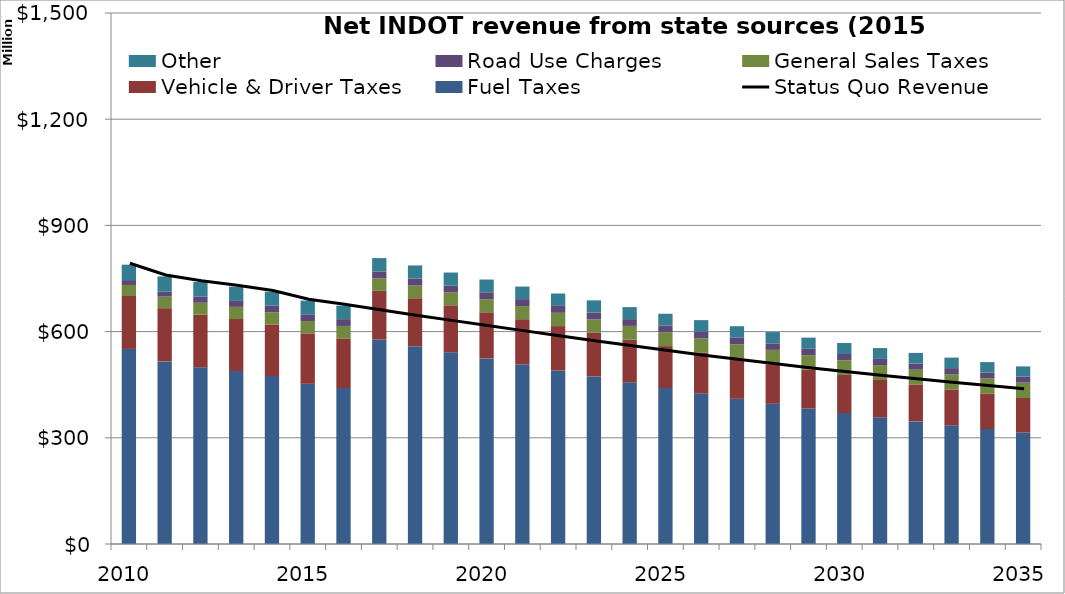
| Category | Fuel Taxes | Vehicle & Driver Taxes | General Sales Taxes | Road Use Charges | Other |
|---|---|---|---|---|---|
| 2010.0 | 551021678.822 | 149601878.461 | 31126844.809 | 13792753.804 | 43446075.375 |
| 2011.0 | 515774752.124 | 150410753.411 | 32641127.149 | 14702584.452 | 42386415 |
| 2012.0 | 498984226.286 | 148663431.89 | 33850812.65 | 17137076.564 | 41352600 |
| 2013.0 | 488463001.237 | 147076709.793 | 34365432.976 | 16756776.055 | 40344000 |
| 2014.0 | 474240087.897 | 146032010.404 | 34352434.178 | 18594417.254 | 39360000 |
| 2015.0 | 452560137.233 | 142541704.908 | 34709004.589 | 18999667.964 | 38784000 |
| 2016.0 | 440661010.657 | 140114744.75 | 35210101.19 | 19164292.938 | 38216429.268 |
| 2017.0 | 577234256.56 | 137761722.966 | 35581391.785 | 19410173.649 | 37657164.45 |
| 2018.0 | 558961859.155 | 135270654.083 | 35963581.581 | 19604103.909 | 37106083.994 |
| 2019.0 | 541401044.245 | 132799645.209 | 36419260.803 | 19657795.415 | 36563068.131 |
| 2020.0 | 524218134.156 | 130353380.32 | 36823762.69 | 19649272.163 | 36027998.841 |
| 2021.0 | 507065044.734 | 127934324.831 | 37150843.888 | 19585506.975 | 35500759.834 |
| 2022.0 | 490059829.89 | 125545670.235 | 37514094.3 | 19478202.83 | 34981236.519 |
| 2023.0 | 473295958.064 | 123189278.785 | 37957959.888 | 19335660.095 | 34469315.985 |
| 2024.0 | 456758930.564 | 120865874.247 | 38423603.46 | 19164438.033 | 33964886.97 |
| 2025.0 | 440521080.477 | 118575752.961 | 38895597.977 | 18969748.516 | 33467839.844 |
| 2026.0 | 424947471.042 | 116318395.479 | 39398972.485 | 18755809.865 | 32978066.578 |
| 2027.0 | 410123744.623 | 114095073.957 | 39936382.666 | 18526110.346 | 32495460.726 |
| 2028.0 | 396024083.745 | 111905778.5 | 40444892.562 | 18283551.377 | 32019917.398 |
| 2029.0 | 382610600.509 | 109750828.754 | 40967223.938 | 18030541.945 | 31551333.241 |
| 2030.0 | 369875249.006 | 107630484.387 | 41524666.051 | 17769158.767 | 31089606.413 |
| 2031.0 | 357773216.729 | 105543866.615 | 42062698.342 | 17501107.054 | 30634636.563 |
| 2032.0 | 346272991 | 103491606.963 | 42632651.186 | 17227858.629 | 30186324.808 |
| 2033.0 | 335288222.736 | 101495534.948 | 42873449.295 | 17155268.502 | 29744573.714 |
| 2034.0 | 324810257.757 | 99534478.653 | 43115607.483 | 17083005.935 | 29309287.269 |
| 2035.0 | 314812154.066 | 97607829.44 | 43359133.431 | 17011061.17 | 28880370.87 |